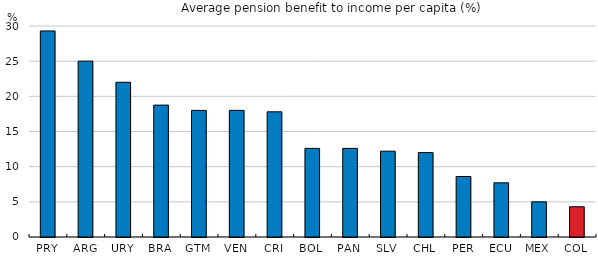
| Category | Series 0 |
|---|---|
| PRY | 29.3 |
| ARG | 25 |
| URY | 22 |
| BRA | 18.752 |
| GTM | 18 |
| VEN | 18 |
| CRI | 17.8 |
| BOL | 12.6 |
| PAN | 12.6 |
| SLV | 12.2 |
| CHL | 12 |
| PER | 8.6 |
| ECU | 7.7 |
| MEX | 5 |
| COL | 4.3 |